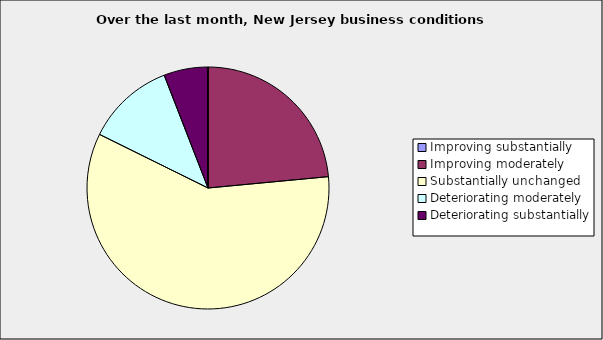
| Category | Series 0 |
|---|---|
| Improving substantially | 0 |
| Improving moderately | 0.235 |
| Substantially unchanged | 0.588 |
| Deteriorating moderately | 0.118 |
| Deteriorating substantially | 0.059 |